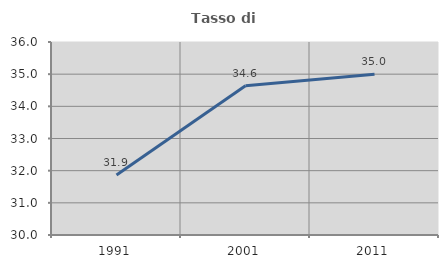
| Category | Tasso di occupazione   |
|---|---|
| 1991.0 | 31.868 |
| 2001.0 | 34.637 |
| 2011.0 | 35 |